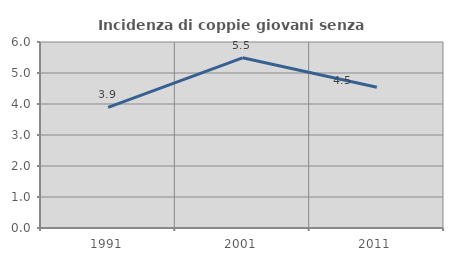
| Category | Incidenza di coppie giovani senza figli |
|---|---|
| 1991.0 | 3.889 |
| 2001.0 | 5.49 |
| 2011.0 | 4.538 |